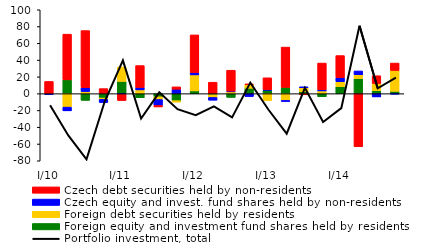
| Category | Foreign equity and investment fund shares held by residents | Foreign debt securities held by residents  | Czech equity and invest. fund shares held by non-residents  | Czech debt securities held by non-residents  |
|---|---|---|---|---|
| I/10 | -0.17 | 0.142 | -0.817 | 14.426 |
| II | 16.467 | -16.027 | -4.451 | 54.462 |
| III | -7.964 | 2.563 | 4.6 | 68.052 |
| IV | -5.164 | -1.632 | -3.738 | 6.036 |
| I/11 | 14.567 | 17.185 | -0.812 | -7.345 |
| II | -4.896 | 4.506 | 2.914 | 26.084 |
| III | -3.713 | -3.275 | -7.125 | -1.717 |
| IV | -8.33 | -1.701 | 5.325 | 2.798 |
| I/12 | 3.306 | 19.066 | 2.798 | 44.867 |
| II | -1.1 | -3.438 | -3.249 | 13.669 |
| III | -4.429 | 2.169 | 0.915 | 24.887 |
| IV | 6.453 | 4.343 | -3.402 | 0.733 |
| I/13 | 4.078 | -8.168 | 0.714 | 14.146 |
| II | 7.436 | -8.051 | -1.279 | 48.104 |
| III | 2.417 | 4.579 | 1.224 | -1.376 |
| IV | -3.652 | 3.278 | 1.402 | 31.82 |
| I/14 | 8.294 | 5.918 | 5.024 | 26.183 |
| II | 17.782 | 4.744 | 4.546 | -63.167 |
| III | 3.481 | 8.634 | -3.872 | 9.272 |
| IV | 2.772 | 24.934 | -0.485 | 8.788 |